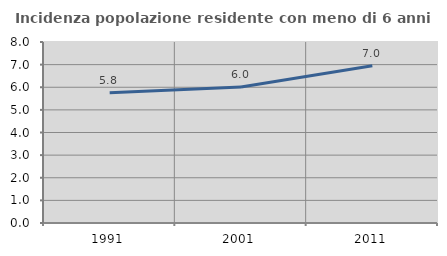
| Category | Incidenza popolazione residente con meno di 6 anni |
|---|---|
| 1991.0 | 5.753 |
| 2001.0 | 6.015 |
| 2011.0 | 6.953 |